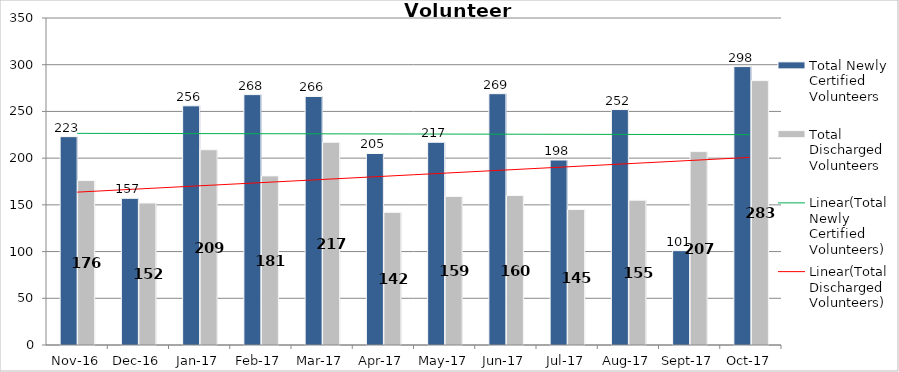
| Category | Total Newly Certified Volunteers | Total Discharged Volunteers |
|---|---|---|
| 2016-11-01 | 223 | 176 |
| 2016-12-01 | 157 | 152 |
| 2017-01-01 | 256 | 209 |
| 2017-02-01 | 268 | 181 |
| 2017-03-01 | 266 | 217 |
| 2017-04-01 | 205 | 142 |
| 2017-05-01 | 217 | 159 |
| 2017-06-01 | 269 | 160 |
| 2017-07-01 | 198 | 145 |
| 2017-08-01 | 252 | 155 |
| 2017-09-01 | 101 | 207 |
| 2017-10-01 | 298 | 283 |